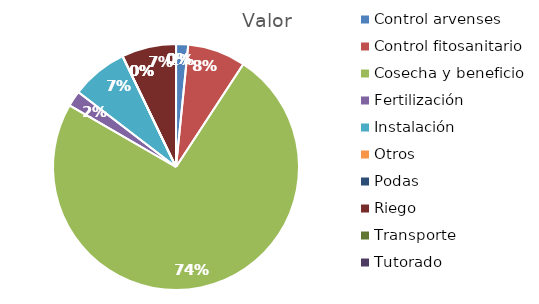
| Category | Valor |
|---|---|
| Control arvenses | 500000 |
| Control fitosanitario | 2400000 |
| Cosecha y beneficio | 23315040 |
| Fertilización | 650000 |
| Instalación | 2340312 |
| Otros | 0 |
| Podas | 0 |
| Riego | 2250000 |
| Transporte | 0 |
| Tutorado | 0 |